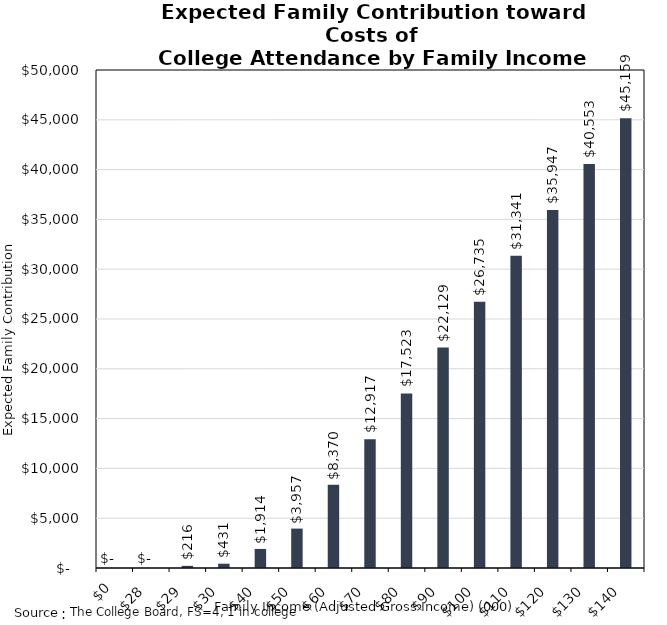
| Category | Series 0 |
|---|---|
| 0.0 | 0 |
| 28.0 | 0 |
| 29.0 | 216 |
| 30.0 | 431 |
| 40.0 | 1914 |
| 50.0 | 3957 |
| 60.0 | 8370 |
| 70.0 | 12917 |
| 80.0 | 17523 |
| 90.0 | 22129 |
| 100.0 | 26735 |
| 110.0 | 31341 |
| 120.0 | 35947 |
| 130.0 | 40553 |
| 140.0 | 45159 |